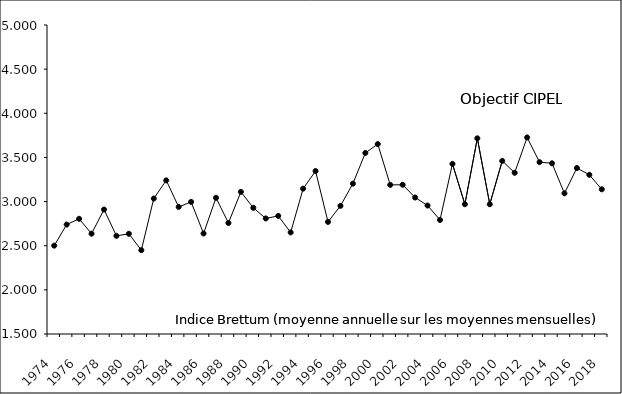
| Category | Series 1 |
|---|---|
| 1974.0 | 2.501 |
| 1975.0 | 2.74 |
| 1976.0 | 2.805 |
| 1977.0 | 2.636 |
| 1978.0 | 2.91 |
| 1979.0 | 2.612 |
| 1980.0 | 2.635 |
| 1981.0 | 2.45 |
| 1982.0 | 3.034 |
| 1983.0 | 3.24 |
| 1984.0 | 2.94 |
| 1985.0 | 2.996 |
| 1986.0 | 2.638 |
| 1987.0 | 3.043 |
| 1988.0 | 2.757 |
| 1989.0 | 3.11 |
| 1990.0 | 2.929 |
| 1991.0 | 2.809 |
| 1992.0 | 2.838 |
| 1993.0 | 2.651 |
| 1994.0 | 3.146 |
| 1995.0 | 3.346 |
| 1996.0 | 2.77 |
| 1997.0 | 2.951 |
| 1998.0 | 3.203 |
| 1999.0 | 3.551 |
| 2000.0 | 3.651 |
| 2001.0 | 3.189 |
| 2002.0 | 3.19 |
| 2003.0 | 3.046 |
| 2004.0 | 2.955 |
| 2005.0 | 2.792 |
| 2006.0 | 3.427 |
| 2007.0 | 2.97 |
| 2008.0 | 3.716 |
| 2009.0 | 2.97 |
| 2010.0 | 3.46 |
| 2011.0 | 3.326 |
| 2012.0 | 3.726 |
| 2013.0 | 3.447 |
| 2014.0 | 3.434 |
| 2015.0 | 3.094 |
| 2016.0 | 3.38 |
| 2017.0 | 3.303 |
| 2018.0 | 3.139 |